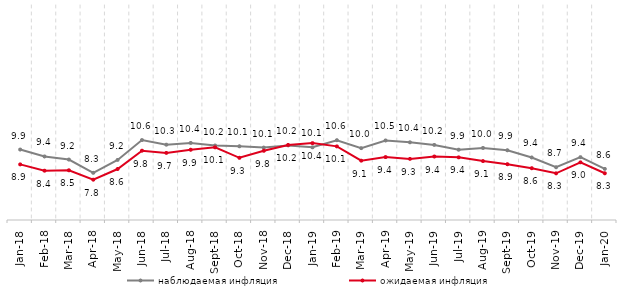
| Category | наблюдаемая инфляция | ожидаемая инфляция |
|---|---|---|
| 2018-01-01 | 9.916 | 8.879 |
| 2018-02-01 | 9.433 | 8.44 |
| 2018-03-01 | 9.218 | 8.469 |
| 2018-04-01 | 8.292 | 7.814 |
| 2018-05-01 | 9.192 | 8.556 |
| 2018-06-01 | 10.578 | 9.837 |
| 2018-07-01 | 10.255 | 9.682 |
| 2018-08-01 | 10.378 | 9.901 |
| 2018-09-01 | 10.196 | 10.07 |
| 2018-10-01 | 10.143 | 9.339 |
| 2018-11-01 | 10.053 | 9.831 |
| 2018-12-01 | 10.205 | 10.236 |
| 2019-01-01 | 10.071 | 10.363 |
| 2019-02-01 | 10.567 | 10.136 |
| 2019-03-01 | 10.013 | 9.141 |
| 2019-04-01 | 10.548 | 9.39 |
| 2019-05-01 | 10.421 | 9.264 |
| 2019-06-01 | 10.239 | 9.429 |
| 2019-07-01 | 9.904 | 9.371 |
| 2019-08-01 | 10.027 | 9.11 |
| 2019-09-01 | 9.867 | 8.894 |
| 2019-10-01 | 9.362 | 8.612 |
| 2019-11-01 | 8.68 | 8.257 |
| 2019-12-01 | 9.383 | 9.022 |
| 2020-01-01 | 8.566 | 8.259 |